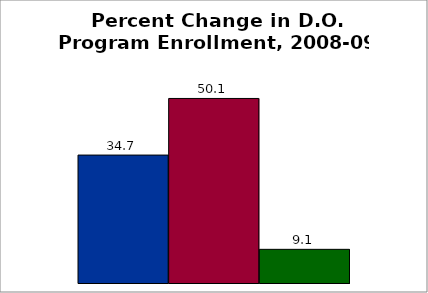
| Category | 50 states and D.C. | SREB states | State |
|---|---|---|---|
| 0 | 34.732 | 50.102 | 9.138 |